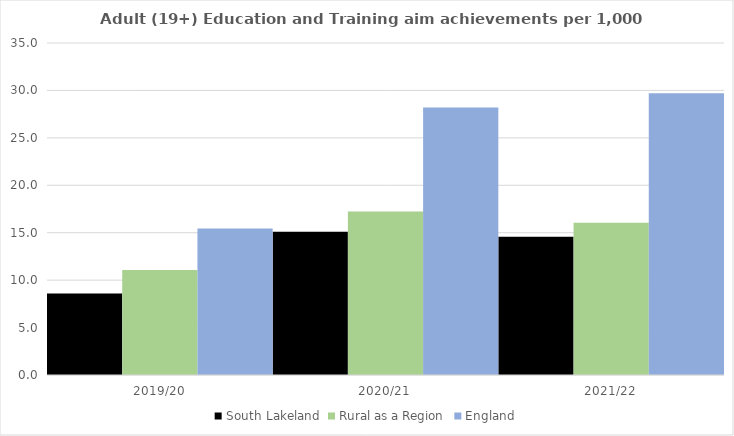
| Category | South Lakeland | Rural as a Region | England |
|---|---|---|---|
| 2019/20 | 8.588 | 11.081 | 15.446 |
| 2020/21 | 15.101 | 17.224 | 28.211 |
| 2021/22 | 14.576 | 16.063 | 29.711 |